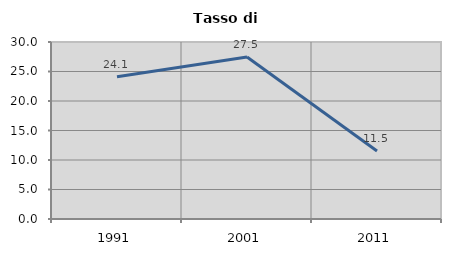
| Category | Tasso di disoccupazione   |
|---|---|
| 1991.0 | 24.096 |
| 2001.0 | 27.451 |
| 2011.0 | 11.525 |